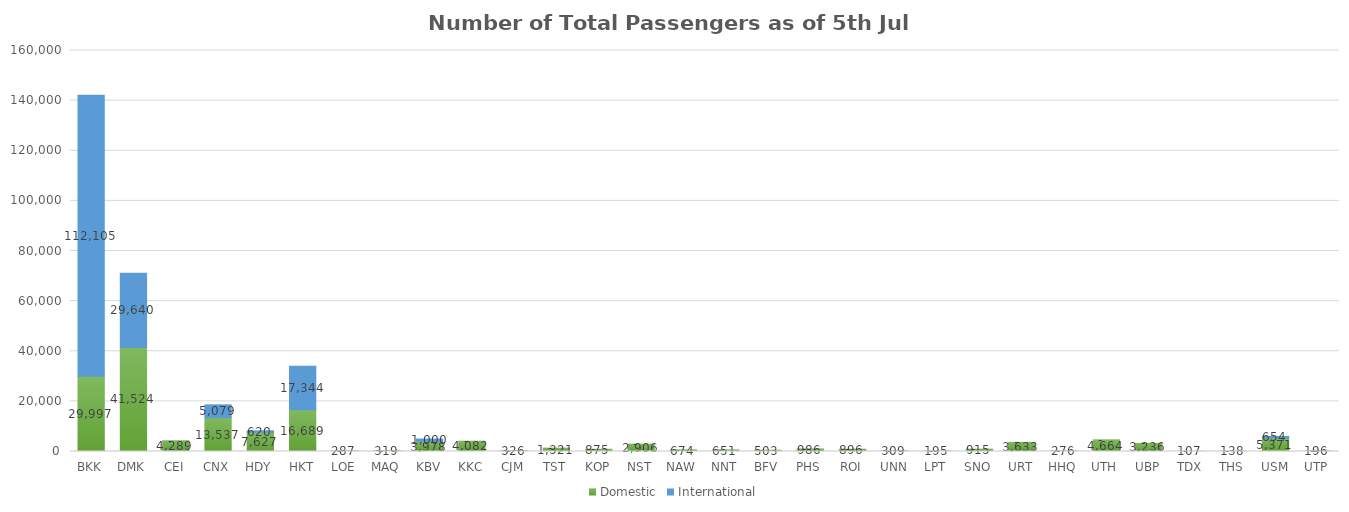
| Category | Domestic | International |
|---|---|---|
| BKK | 29997 | 112105 |
| DMK | 41524 | 29640 |
| CEI | 4289 | 0 |
| CNX | 13537 | 5079 |
| HDY | 7627 | 620 |
| HKT | 16689 | 17344 |
| LOE | 287 | 0 |
| MAQ | 319 | 0 |
| KBV | 3978 | 1000 |
| KKC | 4082 | 0 |
| CJM | 326 | 0 |
| TST | 1321 | 0 |
| KOP | 875 | 0 |
| NST | 2906 | 0 |
| NAW | 674 | 0 |
| NNT | 651 | 0 |
| BFV | 503 | 0 |
| PHS | 986 | 0 |
| ROI | 896 | 0 |
| UNN | 309 | 0 |
| LPT | 195 | 0 |
| SNO | 915 | 0 |
| URT | 3633 | 0 |
| HHQ | 276 | 0 |
| UTH | 4664 | 0 |
| UBP | 3236 | 0 |
| TDX | 107 | 0 |
| THS | 138 | 0 |
| USM | 5371 | 654 |
| UTP | 196 | 0 |